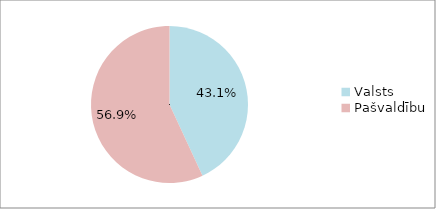
| Category | Series 0 |
|---|---|
| Valsts  | 0.431 |
| Pašvaldību | 0.569 |